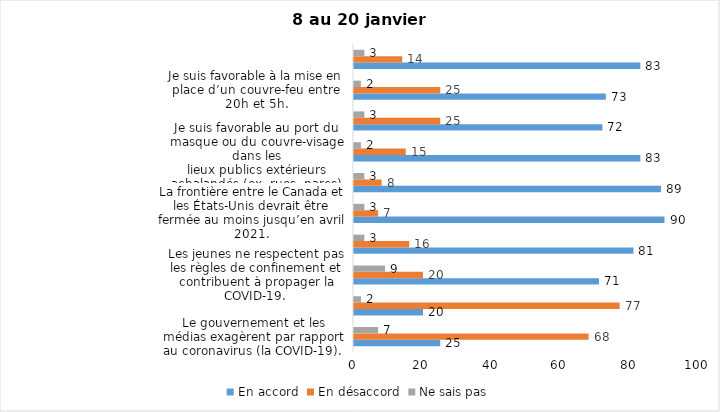
| Category | En accord | En désaccord | Ne sais pas |
|---|---|---|---|
| Le gouvernement et les médias exagèrent par rapport au coronavirus (la COVID-19). | 25 | 68 | 7 |
| Il est exagéré de rester chez soi pour se protéger contre le coronavirus (la COVID-19). | 20 | 77 | 2 |
| Les jeunes ne respectent pas les règles de confinement et contribuent à propager la COVID-19. | 71 | 20 | 9 |
| C’est une bonne chose que les policiers puissent donner facilement des contraventions aux gens qui ne respectent pas les mesures pour prévenir le coronavirus (la COVID-19). | 81 | 16 | 3 |
| La frontière entre le Canada et les États-Unis devrait être fermée au moins jusqu’en avril 2021. | 90 | 7 | 3 |
| J’ai peur que le système de santé soit débordé par les cas de COVID-19 suite à la période des fêtes. | 89 | 8 | 3 |
| Je suis favorable au port du masque ou du couvre-visage dans les
lieux publics extérieurs achalandés (ex. rues, parcs) | 83 | 15 | 2 |
| Je suis favorable à la prolongation de la fermeture des services et commerces non essentiels (salons de coiffure, magasins, industries) jusqu’au 8 février. | 72 | 25 | 3 |
| Je suis favorable à la mise en place d’un couvre-feu entre 20h et 5h. | 73 | 25 | 2 |
| J’ai peur que le renforcement du confinement dure plus longtemps que prévu. | 83 | 14 | 3 |